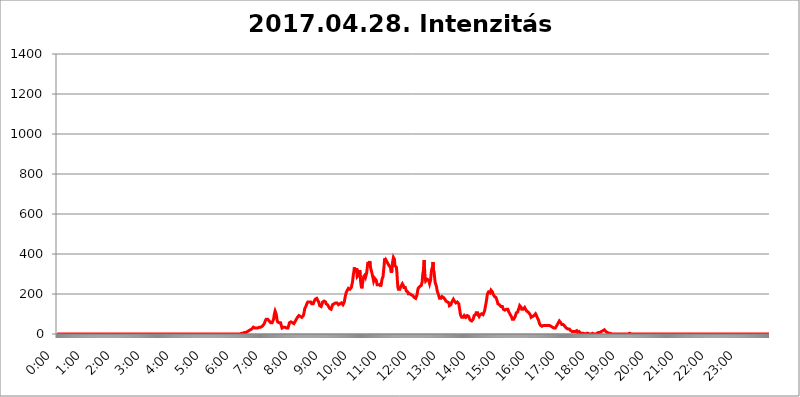
| Category | 2017.04.28. Intenzitás [W/m^2] |
|---|---|
| 0.0 | 0 |
| 0.0006944444444444445 | 0 |
| 0.001388888888888889 | 0 |
| 0.0020833333333333333 | 0 |
| 0.002777777777777778 | 0 |
| 0.003472222222222222 | 0 |
| 0.004166666666666667 | 0 |
| 0.004861111111111111 | 0 |
| 0.005555555555555556 | 0 |
| 0.0062499999999999995 | 0 |
| 0.006944444444444444 | 0 |
| 0.007638888888888889 | 0 |
| 0.008333333333333333 | 0 |
| 0.009027777777777779 | 0 |
| 0.009722222222222222 | 0 |
| 0.010416666666666666 | 0 |
| 0.011111111111111112 | 0 |
| 0.011805555555555555 | 0 |
| 0.012499999999999999 | 0 |
| 0.013194444444444444 | 0 |
| 0.013888888888888888 | 0 |
| 0.014583333333333332 | 0 |
| 0.015277777777777777 | 0 |
| 0.015972222222222224 | 0 |
| 0.016666666666666666 | 0 |
| 0.017361111111111112 | 0 |
| 0.018055555555555557 | 0 |
| 0.01875 | 0 |
| 0.019444444444444445 | 0 |
| 0.02013888888888889 | 0 |
| 0.020833333333333332 | 0 |
| 0.02152777777777778 | 0 |
| 0.022222222222222223 | 0 |
| 0.02291666666666667 | 0 |
| 0.02361111111111111 | 0 |
| 0.024305555555555556 | 0 |
| 0.024999999999999998 | 0 |
| 0.025694444444444447 | 0 |
| 0.02638888888888889 | 0 |
| 0.027083333333333334 | 0 |
| 0.027777777777777776 | 0 |
| 0.02847222222222222 | 0 |
| 0.029166666666666664 | 0 |
| 0.029861111111111113 | 0 |
| 0.030555555555555555 | 0 |
| 0.03125 | 0 |
| 0.03194444444444445 | 0 |
| 0.03263888888888889 | 0 |
| 0.03333333333333333 | 0 |
| 0.034027777777777775 | 0 |
| 0.034722222222222224 | 0 |
| 0.035416666666666666 | 0 |
| 0.036111111111111115 | 0 |
| 0.03680555555555556 | 0 |
| 0.0375 | 0 |
| 0.03819444444444444 | 0 |
| 0.03888888888888889 | 0 |
| 0.03958333333333333 | 0 |
| 0.04027777777777778 | 0 |
| 0.04097222222222222 | 0 |
| 0.041666666666666664 | 0 |
| 0.042361111111111106 | 0 |
| 0.04305555555555556 | 0 |
| 0.043750000000000004 | 0 |
| 0.044444444444444446 | 0 |
| 0.04513888888888889 | 0 |
| 0.04583333333333334 | 0 |
| 0.04652777777777778 | 0 |
| 0.04722222222222222 | 0 |
| 0.04791666666666666 | 0 |
| 0.04861111111111111 | 0 |
| 0.049305555555555554 | 0 |
| 0.049999999999999996 | 0 |
| 0.05069444444444445 | 0 |
| 0.051388888888888894 | 0 |
| 0.052083333333333336 | 0 |
| 0.05277777777777778 | 0 |
| 0.05347222222222222 | 0 |
| 0.05416666666666667 | 0 |
| 0.05486111111111111 | 0 |
| 0.05555555555555555 | 0 |
| 0.05625 | 0 |
| 0.05694444444444444 | 0 |
| 0.057638888888888885 | 0 |
| 0.05833333333333333 | 0 |
| 0.05902777777777778 | 0 |
| 0.059722222222222225 | 0 |
| 0.06041666666666667 | 0 |
| 0.061111111111111116 | 0 |
| 0.06180555555555556 | 0 |
| 0.0625 | 0 |
| 0.06319444444444444 | 0 |
| 0.06388888888888888 | 0 |
| 0.06458333333333334 | 0 |
| 0.06527777777777778 | 0 |
| 0.06597222222222222 | 0 |
| 0.06666666666666667 | 0 |
| 0.06736111111111111 | 0 |
| 0.06805555555555555 | 0 |
| 0.06874999999999999 | 0 |
| 0.06944444444444443 | 0 |
| 0.07013888888888889 | 0 |
| 0.07083333333333333 | 0 |
| 0.07152777777777779 | 0 |
| 0.07222222222222223 | 0 |
| 0.07291666666666667 | 0 |
| 0.07361111111111111 | 0 |
| 0.07430555555555556 | 0 |
| 0.075 | 0 |
| 0.07569444444444444 | 0 |
| 0.0763888888888889 | 0 |
| 0.07708333333333334 | 0 |
| 0.07777777777777778 | 0 |
| 0.07847222222222222 | 0 |
| 0.07916666666666666 | 0 |
| 0.0798611111111111 | 0 |
| 0.08055555555555556 | 0 |
| 0.08125 | 0 |
| 0.08194444444444444 | 0 |
| 0.08263888888888889 | 0 |
| 0.08333333333333333 | 0 |
| 0.08402777777777777 | 0 |
| 0.08472222222222221 | 0 |
| 0.08541666666666665 | 0 |
| 0.08611111111111112 | 0 |
| 0.08680555555555557 | 0 |
| 0.08750000000000001 | 0 |
| 0.08819444444444445 | 0 |
| 0.08888888888888889 | 0 |
| 0.08958333333333333 | 0 |
| 0.09027777777777778 | 0 |
| 0.09097222222222222 | 0 |
| 0.09166666666666667 | 0 |
| 0.09236111111111112 | 0 |
| 0.09305555555555556 | 0 |
| 0.09375 | 0 |
| 0.09444444444444444 | 0 |
| 0.09513888888888888 | 0 |
| 0.09583333333333333 | 0 |
| 0.09652777777777777 | 0 |
| 0.09722222222222222 | 0 |
| 0.09791666666666667 | 0 |
| 0.09861111111111111 | 0 |
| 0.09930555555555555 | 0 |
| 0.09999999999999999 | 0 |
| 0.10069444444444443 | 0 |
| 0.1013888888888889 | 0 |
| 0.10208333333333335 | 0 |
| 0.10277777777777779 | 0 |
| 0.10347222222222223 | 0 |
| 0.10416666666666667 | 0 |
| 0.10486111111111111 | 0 |
| 0.10555555555555556 | 0 |
| 0.10625 | 0 |
| 0.10694444444444444 | 0 |
| 0.1076388888888889 | 0 |
| 0.10833333333333334 | 0 |
| 0.10902777777777778 | 0 |
| 0.10972222222222222 | 0 |
| 0.1111111111111111 | 0 |
| 0.11180555555555556 | 0 |
| 0.11180555555555556 | 0 |
| 0.1125 | 0 |
| 0.11319444444444444 | 0 |
| 0.11388888888888889 | 0 |
| 0.11458333333333333 | 0 |
| 0.11527777777777777 | 0 |
| 0.11597222222222221 | 0 |
| 0.11666666666666665 | 0 |
| 0.1173611111111111 | 0 |
| 0.11805555555555557 | 0 |
| 0.11944444444444445 | 0 |
| 0.12013888888888889 | 0 |
| 0.12083333333333333 | 0 |
| 0.12152777777777778 | 0 |
| 0.12222222222222223 | 0 |
| 0.12291666666666667 | 0 |
| 0.12291666666666667 | 0 |
| 0.12361111111111112 | 0 |
| 0.12430555555555556 | 0 |
| 0.125 | 0 |
| 0.12569444444444444 | 0 |
| 0.12638888888888888 | 0 |
| 0.12708333333333333 | 0 |
| 0.16875 | 0 |
| 0.12847222222222224 | 0 |
| 0.12916666666666668 | 0 |
| 0.12986111111111112 | 0 |
| 0.13055555555555556 | 0 |
| 0.13125 | 0 |
| 0.13194444444444445 | 0 |
| 0.1326388888888889 | 0 |
| 0.13333333333333333 | 0 |
| 0.13402777777777777 | 0 |
| 0.13402777777777777 | 0 |
| 0.13472222222222222 | 0 |
| 0.13541666666666666 | 0 |
| 0.1361111111111111 | 0 |
| 0.13749999999999998 | 0 |
| 0.13819444444444443 | 0 |
| 0.1388888888888889 | 0 |
| 0.13958333333333334 | 0 |
| 0.14027777777777778 | 0 |
| 0.14097222222222222 | 0 |
| 0.14166666666666666 | 0 |
| 0.1423611111111111 | 0 |
| 0.14305555555555557 | 0 |
| 0.14375000000000002 | 0 |
| 0.14444444444444446 | 0 |
| 0.1451388888888889 | 0 |
| 0.1451388888888889 | 0 |
| 0.14652777777777778 | 0 |
| 0.14722222222222223 | 0 |
| 0.14791666666666667 | 0 |
| 0.1486111111111111 | 0 |
| 0.14930555555555555 | 0 |
| 0.15 | 0 |
| 0.15069444444444444 | 0 |
| 0.15138888888888888 | 0 |
| 0.15208333333333332 | 0 |
| 0.15277777777777776 | 0 |
| 0.15347222222222223 | 0 |
| 0.15416666666666667 | 0 |
| 0.15486111111111112 | 0 |
| 0.15555555555555556 | 0 |
| 0.15625 | 0 |
| 0.15694444444444444 | 0 |
| 0.15763888888888888 | 0 |
| 0.15833333333333333 | 0 |
| 0.15902777777777777 | 0 |
| 0.15972222222222224 | 0 |
| 0.16041666666666668 | 0 |
| 0.16111111111111112 | 0 |
| 0.16180555555555556 | 0 |
| 0.1625 | 0 |
| 0.16319444444444445 | 0 |
| 0.1638888888888889 | 0 |
| 0.16458333333333333 | 0 |
| 0.16527777777777777 | 0 |
| 0.16597222222222222 | 0 |
| 0.16666666666666666 | 0 |
| 0.1673611111111111 | 0 |
| 0.16805555555555554 | 0 |
| 0.16874999999999998 | 0 |
| 0.16944444444444443 | 0 |
| 0.17013888888888887 | 0 |
| 0.1708333333333333 | 0 |
| 0.17152777777777775 | 0 |
| 0.17222222222222225 | 0 |
| 0.1729166666666667 | 0 |
| 0.17361111111111113 | 0 |
| 0.17430555555555557 | 0 |
| 0.17500000000000002 | 0 |
| 0.17569444444444446 | 0 |
| 0.1763888888888889 | 0 |
| 0.17708333333333334 | 0 |
| 0.17777777777777778 | 0 |
| 0.17847222222222223 | 0 |
| 0.17916666666666667 | 0 |
| 0.1798611111111111 | 0 |
| 0.18055555555555555 | 0 |
| 0.18125 | 0 |
| 0.18194444444444444 | 0 |
| 0.1826388888888889 | 0 |
| 0.18333333333333335 | 0 |
| 0.1840277777777778 | 0 |
| 0.18472222222222223 | 0 |
| 0.18541666666666667 | 0 |
| 0.18611111111111112 | 0 |
| 0.18680555555555556 | 0 |
| 0.1875 | 0 |
| 0.18819444444444444 | 0 |
| 0.18888888888888888 | 0 |
| 0.18958333333333333 | 0 |
| 0.19027777777777777 | 0 |
| 0.1909722222222222 | 0 |
| 0.19166666666666665 | 0 |
| 0.19236111111111112 | 0 |
| 0.19305555555555554 | 0 |
| 0.19375 | 0 |
| 0.19444444444444445 | 0 |
| 0.1951388888888889 | 0 |
| 0.19583333333333333 | 0 |
| 0.19652777777777777 | 0 |
| 0.19722222222222222 | 0 |
| 0.19791666666666666 | 0 |
| 0.1986111111111111 | 0 |
| 0.19930555555555554 | 0 |
| 0.19999999999999998 | 0 |
| 0.20069444444444443 | 0 |
| 0.20138888888888887 | 0 |
| 0.2020833333333333 | 0 |
| 0.2027777777777778 | 0 |
| 0.2034722222222222 | 0 |
| 0.2041666666666667 | 0 |
| 0.20486111111111113 | 0 |
| 0.20555555555555557 | 0 |
| 0.20625000000000002 | 0 |
| 0.20694444444444446 | 0 |
| 0.2076388888888889 | 0 |
| 0.20833333333333334 | 0 |
| 0.20902777777777778 | 0 |
| 0.20972222222222223 | 0 |
| 0.21041666666666667 | 0 |
| 0.2111111111111111 | 0 |
| 0.21180555555555555 | 0 |
| 0.2125 | 0 |
| 0.21319444444444444 | 0 |
| 0.2138888888888889 | 0 |
| 0.21458333333333335 | 0 |
| 0.2152777777777778 | 0 |
| 0.21597222222222223 | 0 |
| 0.21666666666666667 | 0 |
| 0.21736111111111112 | 0 |
| 0.21805555555555556 | 0 |
| 0.21875 | 0 |
| 0.21944444444444444 | 0 |
| 0.22013888888888888 | 0 |
| 0.22083333333333333 | 0 |
| 0.22152777777777777 | 0 |
| 0.2222222222222222 | 0 |
| 0.22291666666666665 | 0 |
| 0.2236111111111111 | 0 |
| 0.22430555555555556 | 0 |
| 0.225 | 0 |
| 0.22569444444444445 | 0 |
| 0.2263888888888889 | 0 |
| 0.22708333333333333 | 0 |
| 0.22777777777777777 | 0 |
| 0.22847222222222222 | 0 |
| 0.22916666666666666 | 0 |
| 0.2298611111111111 | 0 |
| 0.23055555555555554 | 0 |
| 0.23124999999999998 | 0 |
| 0.23194444444444443 | 0 |
| 0.23263888888888887 | 0 |
| 0.2333333333333333 | 0 |
| 0.2340277777777778 | 0 |
| 0.2347222222222222 | 0 |
| 0.2354166666666667 | 0 |
| 0.23611111111111113 | 0 |
| 0.23680555555555557 | 0 |
| 0.23750000000000002 | 0 |
| 0.23819444444444446 | 0 |
| 0.2388888888888889 | 0 |
| 0.23958333333333334 | 0 |
| 0.24027777777777778 | 0 |
| 0.24097222222222223 | 0 |
| 0.24166666666666667 | 0 |
| 0.2423611111111111 | 0 |
| 0.24305555555555555 | 0 |
| 0.24375 | 0 |
| 0.24444444444444446 | 0 |
| 0.24513888888888888 | 0 |
| 0.24583333333333335 | 0 |
| 0.2465277777777778 | 0 |
| 0.24722222222222223 | 0 |
| 0.24791666666666667 | 0 |
| 0.24861111111111112 | 0 |
| 0.24930555555555556 | 0 |
| 0.25 | 0 |
| 0.25069444444444444 | 0 |
| 0.2513888888888889 | 0 |
| 0.2520833333333333 | 0 |
| 0.25277777777777777 | 0 |
| 0.2534722222222222 | 0 |
| 0.25416666666666665 | 0 |
| 0.2548611111111111 | 0 |
| 0.2555555555555556 | 0 |
| 0.25625000000000003 | 0 |
| 0.2569444444444445 | 3.525 |
| 0.2576388888888889 | 3.525 |
| 0.25833333333333336 | 3.525 |
| 0.2590277777777778 | 3.525 |
| 0.25972222222222224 | 3.525 |
| 0.2604166666666667 | 3.525 |
| 0.2611111111111111 | 3.525 |
| 0.26180555555555557 | 7.887 |
| 0.2625 | 7.887 |
| 0.26319444444444445 | 7.887 |
| 0.2638888888888889 | 7.887 |
| 0.26458333333333334 | 7.887 |
| 0.2652777777777778 | 12.257 |
| 0.2659722222222222 | 12.257 |
| 0.26666666666666666 | 12.257 |
| 0.2673611111111111 | 12.257 |
| 0.26805555555555555 | 16.636 |
| 0.26875 | 16.636 |
| 0.26944444444444443 | 16.636 |
| 0.2701388888888889 | 21.024 |
| 0.2708333333333333 | 21.024 |
| 0.27152777777777776 | 21.024 |
| 0.2722222222222222 | 25.419 |
| 0.27291666666666664 | 25.419 |
| 0.2736111111111111 | 29.823 |
| 0.2743055555555555 | 29.823 |
| 0.27499999999999997 | 34.234 |
| 0.27569444444444446 | 34.234 |
| 0.27638888888888885 | 34.234 |
| 0.27708333333333335 | 29.823 |
| 0.2777777777777778 | 29.823 |
| 0.27847222222222223 | 29.823 |
| 0.2791666666666667 | 29.823 |
| 0.2798611111111111 | 25.419 |
| 0.28055555555555556 | 29.823 |
| 0.28125 | 29.823 |
| 0.28194444444444444 | 34.234 |
| 0.2826388888888889 | 34.234 |
| 0.2833333333333333 | 34.234 |
| 0.28402777777777777 | 34.234 |
| 0.2847222222222222 | 34.234 |
| 0.28541666666666665 | 34.234 |
| 0.28611111111111115 | 38.653 |
| 0.28680555555555554 | 38.653 |
| 0.28750000000000003 | 38.653 |
| 0.2881944444444445 | 38.653 |
| 0.2888888888888889 | 43.079 |
| 0.28958333333333336 | 47.511 |
| 0.2902777777777778 | 51.951 |
| 0.29097222222222224 | 56.398 |
| 0.2916666666666667 | 65.31 |
| 0.2923611111111111 | 69.775 |
| 0.29305555555555557 | 74.246 |
| 0.29375 | 74.246 |
| 0.29444444444444445 | 74.246 |
| 0.2951388888888889 | 74.246 |
| 0.29583333333333334 | 69.775 |
| 0.2965277777777778 | 69.775 |
| 0.2972222222222222 | 65.31 |
| 0.29791666666666666 | 65.31 |
| 0.2986111111111111 | 60.85 |
| 0.29930555555555555 | 56.398 |
| 0.3 | 56.398 |
| 0.30069444444444443 | 56.398 |
| 0.3013888888888889 | 56.398 |
| 0.3020833333333333 | 56.398 |
| 0.30277777777777776 | 60.85 |
| 0.3034722222222222 | 74.246 |
| 0.30416666666666664 | 92.184 |
| 0.3048611111111111 | 105.69 |
| 0.3055555555555555 | 114.716 |
| 0.30624999999999997 | 110.201 |
| 0.3069444444444444 | 101.184 |
| 0.3076388888888889 | 87.692 |
| 0.30833333333333335 | 69.775 |
| 0.3090277777777778 | 60.85 |
| 0.30972222222222223 | 56.398 |
| 0.3104166666666667 | 56.398 |
| 0.3111111111111111 | 56.398 |
| 0.31180555555555556 | 60.85 |
| 0.3125 | 60.85 |
| 0.31319444444444444 | 56.398 |
| 0.3138888888888889 | 47.511 |
| 0.3145833333333333 | 38.653 |
| 0.31527777777777777 | 29.823 |
| 0.3159722222222222 | 29.823 |
| 0.31666666666666665 | 29.823 |
| 0.31736111111111115 | 34.234 |
| 0.31805555555555554 | 34.234 |
| 0.31875000000000003 | 38.653 |
| 0.3194444444444445 | 34.234 |
| 0.3201388888888889 | 34.234 |
| 0.32083333333333336 | 34.234 |
| 0.3215277777777778 | 29.823 |
| 0.32222222222222224 | 29.823 |
| 0.3229166666666667 | 29.823 |
| 0.3236111111111111 | 29.823 |
| 0.32430555555555557 | 38.653 |
| 0.325 | 47.511 |
| 0.32569444444444445 | 56.398 |
| 0.3263888888888889 | 60.85 |
| 0.32708333333333334 | 60.85 |
| 0.3277777777777778 | 60.85 |
| 0.3284722222222222 | 60.85 |
| 0.32916666666666666 | 56.398 |
| 0.3298611111111111 | 56.398 |
| 0.33055555555555555 | 51.951 |
| 0.33125 | 51.951 |
| 0.33194444444444443 | 51.951 |
| 0.3326388888888889 | 56.398 |
| 0.3333333333333333 | 60.85 |
| 0.3340277777777778 | 65.31 |
| 0.3347222222222222 | 65.31 |
| 0.3354166666666667 | 74.246 |
| 0.3361111111111111 | 78.722 |
| 0.3368055555555556 | 83.205 |
| 0.33749999999999997 | 83.205 |
| 0.33819444444444446 | 87.692 |
| 0.33888888888888885 | 92.184 |
| 0.33958333333333335 | 92.184 |
| 0.34027777777777773 | 92.184 |
| 0.34097222222222223 | 87.692 |
| 0.3416666666666666 | 83.205 |
| 0.3423611111111111 | 83.205 |
| 0.3430555555555555 | 83.205 |
| 0.34375 | 83.205 |
| 0.3444444444444445 | 83.205 |
| 0.3451388888888889 | 92.184 |
| 0.3458333333333334 | 101.184 |
| 0.34652777777777777 | 114.716 |
| 0.34722222222222227 | 128.284 |
| 0.34791666666666665 | 132.814 |
| 0.34861111111111115 | 137.347 |
| 0.34930555555555554 | 141.884 |
| 0.35000000000000003 | 150.964 |
| 0.3506944444444444 | 155.509 |
| 0.3513888888888889 | 160.056 |
| 0.3520833333333333 | 164.605 |
| 0.3527777777777778 | 164.605 |
| 0.3534722222222222 | 160.056 |
| 0.3541666666666667 | 160.056 |
| 0.3548611111111111 | 160.056 |
| 0.35555555555555557 | 160.056 |
| 0.35625 | 155.509 |
| 0.35694444444444445 | 150.964 |
| 0.3576388888888889 | 150.964 |
| 0.35833333333333334 | 150.964 |
| 0.3590277777777778 | 150.964 |
| 0.3597222222222222 | 155.509 |
| 0.36041666666666666 | 164.605 |
| 0.3611111111111111 | 169.156 |
| 0.36180555555555555 | 173.709 |
| 0.3625 | 173.709 |
| 0.36319444444444443 | 178.264 |
| 0.3638888888888889 | 178.264 |
| 0.3645833333333333 | 173.709 |
| 0.3652777777777778 | 169.156 |
| 0.3659722222222222 | 164.605 |
| 0.3666666666666667 | 160.056 |
| 0.3673611111111111 | 150.964 |
| 0.3680555555555556 | 141.884 |
| 0.36874999999999997 | 137.347 |
| 0.36944444444444446 | 137.347 |
| 0.37013888888888885 | 137.347 |
| 0.37083333333333335 | 141.884 |
| 0.37152777777777773 | 150.964 |
| 0.37222222222222223 | 160.056 |
| 0.3729166666666666 | 164.605 |
| 0.3736111111111111 | 164.605 |
| 0.3743055555555555 | 164.605 |
| 0.375 | 169.156 |
| 0.3756944444444445 | 164.605 |
| 0.3763888888888889 | 160.056 |
| 0.3770833333333334 | 150.964 |
| 0.37777777777777777 | 150.964 |
| 0.37847222222222227 | 150.964 |
| 0.37916666666666665 | 146.423 |
| 0.37986111111111115 | 146.423 |
| 0.38055555555555554 | 137.347 |
| 0.38125000000000003 | 132.814 |
| 0.3819444444444444 | 128.284 |
| 0.3826388888888889 | 128.284 |
| 0.3833333333333333 | 123.758 |
| 0.3840277777777778 | 123.758 |
| 0.3847222222222222 | 128.284 |
| 0.3854166666666667 | 137.347 |
| 0.3861111111111111 | 146.423 |
| 0.38680555555555557 | 150.964 |
| 0.3875 | 150.964 |
| 0.38819444444444445 | 150.964 |
| 0.3888888888888889 | 150.964 |
| 0.38958333333333334 | 155.509 |
| 0.3902777777777778 | 155.509 |
| 0.3909722222222222 | 155.509 |
| 0.39166666666666666 | 155.509 |
| 0.3923611111111111 | 155.509 |
| 0.39305555555555555 | 155.509 |
| 0.39375 | 150.964 |
| 0.39444444444444443 | 146.423 |
| 0.3951388888888889 | 146.423 |
| 0.3958333333333333 | 146.423 |
| 0.3965277777777778 | 150.964 |
| 0.3972222222222222 | 150.964 |
| 0.3979166666666667 | 150.964 |
| 0.3986111111111111 | 155.509 |
| 0.3993055555555556 | 150.964 |
| 0.39999999999999997 | 150.964 |
| 0.40069444444444446 | 146.423 |
| 0.40138888888888885 | 150.964 |
| 0.40208333333333335 | 155.509 |
| 0.40277777777777773 | 164.605 |
| 0.40347222222222223 | 178.264 |
| 0.4041666666666666 | 191.937 |
| 0.4048611111111111 | 201.058 |
| 0.4055555555555555 | 210.182 |
| 0.40625 | 210.182 |
| 0.4069444444444445 | 219.309 |
| 0.4076388888888889 | 223.873 |
| 0.4083333333333334 | 228.436 |
| 0.40902777777777777 | 228.436 |
| 0.40972222222222227 | 228.436 |
| 0.41041666666666665 | 223.873 |
| 0.41111111111111115 | 219.309 |
| 0.41180555555555554 | 223.873 |
| 0.41250000000000003 | 233 |
| 0.4131944444444444 | 246.689 |
| 0.4138888888888889 | 255.813 |
| 0.4145833333333333 | 274.047 |
| 0.4152777777777778 | 296.808 |
| 0.4159722222222222 | 310.44 |
| 0.4166666666666667 | 333.113 |
| 0.4173611111111111 | 319.517 |
| 0.41805555555555557 | 314.98 |
| 0.41875 | 314.98 |
| 0.41944444444444445 | 314.98 |
| 0.4201388888888889 | 328.584 |
| 0.42083333333333334 | 287.709 |
| 0.4215277777777778 | 287.709 |
| 0.4222222222222222 | 292.259 |
| 0.42291666666666666 | 296.808 |
| 0.4236111111111111 | 296.808 |
| 0.42430555555555555 | 319.517 |
| 0.425 | 283.156 |
| 0.42569444444444443 | 255.813 |
| 0.4263888888888889 | 237.564 |
| 0.4270833333333333 | 228.436 |
| 0.4277777777777778 | 242.127 |
| 0.4284722222222222 | 260.373 |
| 0.4291666666666667 | 274.047 |
| 0.4298611111111111 | 287.709 |
| 0.4305555555555556 | 287.709 |
| 0.43124999999999997 | 292.259 |
| 0.43194444444444446 | 296.808 |
| 0.43263888888888885 | 287.709 |
| 0.43333333333333335 | 292.259 |
| 0.43402777777777773 | 305.898 |
| 0.43472222222222223 | 328.584 |
| 0.4354166666666666 | 351.198 |
| 0.4361111111111111 | 360.221 |
| 0.4368055555555555 | 346.682 |
| 0.4375 | 355.712 |
| 0.4381944444444445 | 364.728 |
| 0.4388888888888889 | 351.198 |
| 0.4395833333333334 | 328.584 |
| 0.44027777777777777 | 319.517 |
| 0.44097222222222227 | 310.44 |
| 0.44166666666666665 | 305.898 |
| 0.44236111111111115 | 287.709 |
| 0.44305555555555554 | 278.603 |
| 0.44375000000000003 | 264.932 |
| 0.4444444444444444 | 269.49 |
| 0.4451388888888889 | 278.603 |
| 0.4458333333333333 | 283.156 |
| 0.4465277777777778 | 278.603 |
| 0.4472222222222222 | 269.49 |
| 0.4479166666666667 | 260.373 |
| 0.4486111111111111 | 246.689 |
| 0.44930555555555557 | 242.127 |
| 0.45 | 242.127 |
| 0.45069444444444445 | 246.689 |
| 0.4513888888888889 | 251.251 |
| 0.45208333333333334 | 251.251 |
| 0.4527777777777778 | 246.689 |
| 0.4534722222222222 | 237.564 |
| 0.45416666666666666 | 242.127 |
| 0.4548611111111111 | 260.373 |
| 0.45555555555555555 | 274.047 |
| 0.45625 | 278.603 |
| 0.45694444444444443 | 287.709 |
| 0.4576388888888889 | 314.98 |
| 0.4583333333333333 | 337.639 |
| 0.4590277777777778 | 369.23 |
| 0.4597222222222222 | 378.224 |
| 0.4604166666666667 | 360.221 |
| 0.4611111111111111 | 369.23 |
| 0.4618055555555556 | 369.23 |
| 0.46249999999999997 | 364.728 |
| 0.46319444444444446 | 355.712 |
| 0.46388888888888885 | 351.198 |
| 0.46458333333333335 | 351.198 |
| 0.46527777777777773 | 342.162 |
| 0.46597222222222223 | 337.639 |
| 0.4666666666666666 | 342.162 |
| 0.4673611111111111 | 333.113 |
| 0.4680555555555555 | 314.98 |
| 0.46875 | 305.898 |
| 0.4694444444444445 | 319.517 |
| 0.4701388888888889 | 355.712 |
| 0.4708333333333334 | 369.23 |
| 0.47152777777777777 | 382.715 |
| 0.47222222222222227 | 382.715 |
| 0.47291666666666665 | 373.729 |
| 0.47361111111111115 | 342.162 |
| 0.47430555555555554 | 346.682 |
| 0.47500000000000003 | 342.162 |
| 0.4756944444444444 | 333.113 |
| 0.4763888888888889 | 305.898 |
| 0.4770833333333333 | 264.932 |
| 0.4777777777777778 | 233 |
| 0.4784722222222222 | 223.873 |
| 0.4791666666666667 | 219.309 |
| 0.4798611111111111 | 219.309 |
| 0.48055555555555557 | 223.873 |
| 0.48125 | 233 |
| 0.48194444444444445 | 237.564 |
| 0.4826388888888889 | 242.127 |
| 0.48333333333333334 | 246.689 |
| 0.4840277777777778 | 251.251 |
| 0.4847222222222222 | 251.251 |
| 0.48541666666666666 | 242.127 |
| 0.4861111111111111 | 233 |
| 0.48680555555555555 | 233 |
| 0.4875 | 233 |
| 0.48819444444444443 | 233 |
| 0.4888888888888889 | 223.873 |
| 0.4895833333333333 | 214.746 |
| 0.4902777777777778 | 214.746 |
| 0.4909722222222222 | 214.746 |
| 0.4916666666666667 | 210.182 |
| 0.4923611111111111 | 201.058 |
| 0.4930555555555556 | 196.497 |
| 0.49374999999999997 | 201.058 |
| 0.49444444444444446 | 201.058 |
| 0.49513888888888885 | 201.058 |
| 0.49583333333333335 | 201.058 |
| 0.49652777777777773 | 196.497 |
| 0.49722222222222223 | 191.937 |
| 0.4979166666666666 | 191.937 |
| 0.4986111111111111 | 191.937 |
| 0.4993055555555555 | 187.378 |
| 0.5 | 187.378 |
| 0.5006944444444444 | 182.82 |
| 0.5013888888888889 | 182.82 |
| 0.5020833333333333 | 178.264 |
| 0.5027777777777778 | 178.264 |
| 0.5034722222222222 | 182.82 |
| 0.5041666666666667 | 191.937 |
| 0.5048611111111111 | 201.058 |
| 0.5055555555555555 | 219.309 |
| 0.50625 | 228.436 |
| 0.5069444444444444 | 233 |
| 0.5076388888888889 | 233 |
| 0.5083333333333333 | 237.564 |
| 0.5090277777777777 | 242.127 |
| 0.5097222222222222 | 242.127 |
| 0.5104166666666666 | 242.127 |
| 0.5111111111111112 | 246.689 |
| 0.5118055555555555 | 260.373 |
| 0.5125000000000001 | 292.259 |
| 0.5131944444444444 | 310.44 |
| 0.513888888888889 | 337.639 |
| 0.5145833333333333 | 369.23 |
| 0.5152777777777778 | 319.517 |
| 0.5159722222222222 | 278.603 |
| 0.5166666666666667 | 264.932 |
| 0.517361111111111 | 264.932 |
| 0.5180555555555556 | 264.932 |
| 0.5187499999999999 | 274.047 |
| 0.5194444444444445 | 278.603 |
| 0.5201388888888888 | 274.047 |
| 0.5208333333333334 | 269.49 |
| 0.5215277777777778 | 260.373 |
| 0.5222222222222223 | 251.251 |
| 0.5229166666666667 | 251.251 |
| 0.5236111111111111 | 269.49 |
| 0.5243055555555556 | 296.808 |
| 0.525 | 319.517 |
| 0.5256944444444445 | 328.584 |
| 0.5263888888888889 | 337.639 |
| 0.5270833333333333 | 360.221 |
| 0.5277777777777778 | 319.517 |
| 0.5284722222222222 | 310.44 |
| 0.5291666666666667 | 287.709 |
| 0.5298611111111111 | 260.373 |
| 0.5305555555555556 | 251.251 |
| 0.53125 | 251.251 |
| 0.5319444444444444 | 237.564 |
| 0.5326388888888889 | 219.309 |
| 0.5333333333333333 | 210.182 |
| 0.5340277777777778 | 205.62 |
| 0.5347222222222222 | 196.497 |
| 0.5354166666666667 | 187.378 |
| 0.5361111111111111 | 178.264 |
| 0.5368055555555555 | 178.264 |
| 0.5375 | 182.82 |
| 0.5381944444444444 | 178.264 |
| 0.5388888888888889 | 182.82 |
| 0.5395833333333333 | 187.378 |
| 0.5402777777777777 | 191.937 |
| 0.5409722222222222 | 187.378 |
| 0.5416666666666666 | 182.82 |
| 0.5423611111111112 | 182.82 |
| 0.5430555555555555 | 178.264 |
| 0.5437500000000001 | 173.709 |
| 0.5444444444444444 | 173.709 |
| 0.545138888888889 | 164.605 |
| 0.5458333333333333 | 160.056 |
| 0.5465277777777778 | 160.056 |
| 0.5472222222222222 | 160.056 |
| 0.5479166666666667 | 160.056 |
| 0.548611111111111 | 160.056 |
| 0.5493055555555556 | 155.509 |
| 0.5499999999999999 | 141.884 |
| 0.5506944444444445 | 137.347 |
| 0.5513888888888888 | 141.884 |
| 0.5520833333333334 | 146.423 |
| 0.5527777777777778 | 155.509 |
| 0.5534722222222223 | 160.056 |
| 0.5541666666666667 | 164.605 |
| 0.5548611111111111 | 169.156 |
| 0.5555555555555556 | 173.709 |
| 0.55625 | 169.156 |
| 0.5569444444444445 | 164.605 |
| 0.5576388888888889 | 160.056 |
| 0.5583333333333333 | 160.056 |
| 0.5590277777777778 | 155.509 |
| 0.5597222222222222 | 155.509 |
| 0.5604166666666667 | 155.509 |
| 0.5611111111111111 | 160.056 |
| 0.5618055555555556 | 164.605 |
| 0.5625 | 164.605 |
| 0.5631944444444444 | 150.964 |
| 0.5638888888888889 | 132.814 |
| 0.5645833333333333 | 119.235 |
| 0.5652777777777778 | 101.184 |
| 0.5659722222222222 | 92.184 |
| 0.5666666666666667 | 87.692 |
| 0.5673611111111111 | 83.205 |
| 0.5680555555555555 | 83.205 |
| 0.56875 | 83.205 |
| 0.5694444444444444 | 83.205 |
| 0.5701388888888889 | 83.205 |
| 0.5708333333333333 | 92.184 |
| 0.5715277777777777 | 92.184 |
| 0.5722222222222222 | 92.184 |
| 0.5729166666666666 | 83.205 |
| 0.5736111111111112 | 83.205 |
| 0.5743055555555555 | 87.692 |
| 0.5750000000000001 | 92.184 |
| 0.5756944444444444 | 96.682 |
| 0.576388888888889 | 96.682 |
| 0.5770833333333333 | 87.692 |
| 0.5777777777777778 | 78.722 |
| 0.5784722222222222 | 74.246 |
| 0.5791666666666667 | 69.775 |
| 0.579861111111111 | 65.31 |
| 0.5805555555555556 | 65.31 |
| 0.5812499999999999 | 65.31 |
| 0.5819444444444445 | 65.31 |
| 0.5826388888888888 | 65.31 |
| 0.5833333333333334 | 74.246 |
| 0.5840277777777778 | 83.205 |
| 0.5847222222222223 | 92.184 |
| 0.5854166666666667 | 92.184 |
| 0.5861111111111111 | 92.184 |
| 0.5868055555555556 | 96.682 |
| 0.5875 | 105.69 |
| 0.5881944444444445 | 110.201 |
| 0.5888888888888889 | 110.201 |
| 0.5895833333333333 | 105.69 |
| 0.5902777777777778 | 96.682 |
| 0.5909722222222222 | 92.184 |
| 0.5916666666666667 | 87.692 |
| 0.5923611111111111 | 92.184 |
| 0.5930555555555556 | 96.682 |
| 0.59375 | 96.682 |
| 0.5944444444444444 | 96.682 |
| 0.5951388888888889 | 101.184 |
| 0.5958333333333333 | 101.184 |
| 0.5965277777777778 | 101.184 |
| 0.5972222222222222 | 96.682 |
| 0.5979166666666667 | 96.682 |
| 0.5986111111111111 | 101.184 |
| 0.5993055555555555 | 114.716 |
| 0.6 | 128.284 |
| 0.6006944444444444 | 141.884 |
| 0.6013888888888889 | 155.509 |
| 0.6020833333333333 | 169.156 |
| 0.6027777777777777 | 187.378 |
| 0.6034722222222222 | 201.058 |
| 0.6041666666666666 | 205.62 |
| 0.6048611111111112 | 210.182 |
| 0.6055555555555555 | 210.182 |
| 0.6062500000000001 | 205.62 |
| 0.6069444444444444 | 205.62 |
| 0.607638888888889 | 210.182 |
| 0.6083333333333333 | 219.309 |
| 0.6090277777777778 | 219.309 |
| 0.6097222222222222 | 219.309 |
| 0.6104166666666667 | 210.182 |
| 0.611111111111111 | 201.058 |
| 0.6118055555555556 | 201.058 |
| 0.6124999999999999 | 196.497 |
| 0.6131944444444445 | 187.378 |
| 0.6138888888888888 | 182.82 |
| 0.6145833333333334 | 182.82 |
| 0.6152777777777778 | 182.82 |
| 0.6159722222222223 | 178.264 |
| 0.6166666666666667 | 169.156 |
| 0.6173611111111111 | 160.056 |
| 0.6180555555555556 | 150.964 |
| 0.61875 | 146.423 |
| 0.6194444444444445 | 146.423 |
| 0.6201388888888889 | 146.423 |
| 0.6208333333333333 | 146.423 |
| 0.6215277777777778 | 146.423 |
| 0.6222222222222222 | 137.347 |
| 0.6229166666666667 | 137.347 |
| 0.6236111111111111 | 137.347 |
| 0.6243055555555556 | 137.347 |
| 0.625 | 132.814 |
| 0.6256944444444444 | 123.758 |
| 0.6263888888888889 | 119.235 |
| 0.6270833333333333 | 119.235 |
| 0.6277777777777778 | 119.235 |
| 0.6284722222222222 | 119.235 |
| 0.6291666666666667 | 123.758 |
| 0.6298611111111111 | 123.758 |
| 0.6305555555555555 | 123.758 |
| 0.63125 | 123.758 |
| 0.6319444444444444 | 123.758 |
| 0.6326388888888889 | 119.235 |
| 0.6333333333333333 | 110.201 |
| 0.6340277777777777 | 105.69 |
| 0.6347222222222222 | 101.184 |
| 0.6354166666666666 | 96.682 |
| 0.6361111111111112 | 92.184 |
| 0.6368055555555555 | 87.692 |
| 0.6375000000000001 | 83.205 |
| 0.6381944444444444 | 74.246 |
| 0.638888888888889 | 74.246 |
| 0.6395833333333333 | 74.246 |
| 0.6402777777777778 | 74.246 |
| 0.6409722222222222 | 74.246 |
| 0.6416666666666667 | 78.722 |
| 0.642361111111111 | 87.692 |
| 0.6430555555555556 | 96.682 |
| 0.6437499999999999 | 105.69 |
| 0.6444444444444445 | 110.201 |
| 0.6451388888888888 | 110.201 |
| 0.6458333333333334 | 110.201 |
| 0.6465277777777778 | 119.235 |
| 0.6472222222222223 | 123.758 |
| 0.6479166666666667 | 132.814 |
| 0.6486111111111111 | 141.884 |
| 0.6493055555555556 | 146.423 |
| 0.65 | 141.884 |
| 0.6506944444444445 | 132.814 |
| 0.6513888888888889 | 123.758 |
| 0.6520833333333333 | 119.235 |
| 0.6527777777777778 | 119.235 |
| 0.6534722222222222 | 123.758 |
| 0.6541666666666667 | 128.284 |
| 0.6548611111111111 | 128.284 |
| 0.6555555555555556 | 132.814 |
| 0.65625 | 128.284 |
| 0.6569444444444444 | 123.758 |
| 0.6576388888888889 | 119.235 |
| 0.6583333333333333 | 114.716 |
| 0.6590277777777778 | 110.201 |
| 0.6597222222222222 | 110.201 |
| 0.6604166666666667 | 110.201 |
| 0.6611111111111111 | 105.69 |
| 0.6618055555555555 | 105.69 |
| 0.6625 | 101.184 |
| 0.6631944444444444 | 101.184 |
| 0.6638888888888889 | 92.184 |
| 0.6645833333333333 | 83.205 |
| 0.6652777777777777 | 83.205 |
| 0.6659722222222222 | 83.205 |
| 0.6666666666666666 | 87.692 |
| 0.6673611111111111 | 87.692 |
| 0.6680555555555556 | 92.184 |
| 0.6687500000000001 | 92.184 |
| 0.6694444444444444 | 92.184 |
| 0.6701388888888888 | 96.682 |
| 0.6708333333333334 | 101.184 |
| 0.6715277777777778 | 96.682 |
| 0.6722222222222222 | 92.184 |
| 0.6729166666666666 | 87.692 |
| 0.6736111111111112 | 78.722 |
| 0.6743055555555556 | 74.246 |
| 0.6749999999999999 | 69.775 |
| 0.6756944444444444 | 60.85 |
| 0.6763888888888889 | 51.951 |
| 0.6770833333333334 | 47.511 |
| 0.6777777777777777 | 43.079 |
| 0.6784722222222223 | 43.079 |
| 0.6791666666666667 | 43.079 |
| 0.6798611111111111 | 38.653 |
| 0.6805555555555555 | 38.653 |
| 0.68125 | 43.079 |
| 0.6819444444444445 | 43.079 |
| 0.6826388888888889 | 43.079 |
| 0.6833333333333332 | 43.079 |
| 0.6840277777777778 | 43.079 |
| 0.6847222222222222 | 43.079 |
| 0.6854166666666667 | 43.079 |
| 0.686111111111111 | 43.079 |
| 0.6868055555555556 | 47.511 |
| 0.6875 | 47.511 |
| 0.6881944444444444 | 43.079 |
| 0.688888888888889 | 43.079 |
| 0.6895833333333333 | 43.079 |
| 0.6902777777777778 | 43.079 |
| 0.6909722222222222 | 43.079 |
| 0.6916666666666668 | 43.079 |
| 0.6923611111111111 | 38.653 |
| 0.6930555555555555 | 38.653 |
| 0.69375 | 34.234 |
| 0.6944444444444445 | 34.234 |
| 0.6951388888888889 | 29.823 |
| 0.6958333333333333 | 29.823 |
| 0.6965277777777777 | 29.823 |
| 0.6972222222222223 | 29.823 |
| 0.6979166666666666 | 29.823 |
| 0.6986111111111111 | 29.823 |
| 0.6993055555555556 | 34.234 |
| 0.7000000000000001 | 38.653 |
| 0.7006944444444444 | 43.079 |
| 0.7013888888888888 | 47.511 |
| 0.7020833333333334 | 51.951 |
| 0.7027777777777778 | 56.398 |
| 0.7034722222222222 | 60.85 |
| 0.7041666666666666 | 65.31 |
| 0.7048611111111112 | 65.31 |
| 0.7055555555555556 | 65.31 |
| 0.7062499999999999 | 56.398 |
| 0.7069444444444444 | 51.951 |
| 0.7076388888888889 | 47.511 |
| 0.7083333333333334 | 47.511 |
| 0.7090277777777777 | 47.511 |
| 0.7097222222222223 | 47.511 |
| 0.7104166666666667 | 47.511 |
| 0.7111111111111111 | 43.079 |
| 0.7118055555555555 | 38.653 |
| 0.7125 | 38.653 |
| 0.7131944444444445 | 34.234 |
| 0.7138888888888889 | 29.823 |
| 0.7145833333333332 | 29.823 |
| 0.7152777777777778 | 29.823 |
| 0.7159722222222222 | 25.419 |
| 0.7166666666666667 | 25.419 |
| 0.717361111111111 | 25.419 |
| 0.7180555555555556 | 25.419 |
| 0.71875 | 21.024 |
| 0.7194444444444444 | 21.024 |
| 0.720138888888889 | 16.636 |
| 0.7208333333333333 | 12.257 |
| 0.7215277777777778 | 12.257 |
| 0.7222222222222222 | 12.257 |
| 0.7229166666666668 | 7.887 |
| 0.7236111111111111 | 7.887 |
| 0.7243055555555555 | 12.257 |
| 0.725 | 12.257 |
| 0.7256944444444445 | 12.257 |
| 0.7263888888888889 | 12.257 |
| 0.7270833333333333 | 16.636 |
| 0.7277777777777777 | 16.636 |
| 0.7284722222222223 | 16.636 |
| 0.7291666666666666 | 16.636 |
| 0.7298611111111111 | 7.887 |
| 0.7305555555555556 | 3.525 |
| 0.7312500000000001 | 7.887 |
| 0.7319444444444444 | 12.257 |
| 0.7326388888888888 | 12.257 |
| 0.7333333333333334 | 7.887 |
| 0.7340277777777778 | 3.525 |
| 0.7347222222222222 | 3.525 |
| 0.7354166666666666 | 3.525 |
| 0.7361111111111112 | 3.525 |
| 0.7368055555555556 | 7.887 |
| 0.7374999999999999 | 3.525 |
| 0.7381944444444444 | 3.525 |
| 0.7388888888888889 | 3.525 |
| 0.7395833333333334 | 3.525 |
| 0.7402777777777777 | 0 |
| 0.7409722222222223 | 0 |
| 0.7416666666666667 | 3.525 |
| 0.7423611111111111 | 3.525 |
| 0.7430555555555555 | 3.525 |
| 0.74375 | 0 |
| 0.7444444444444445 | 3.525 |
| 0.7451388888888889 | 0 |
| 0.7458333333333332 | 0 |
| 0.7465277777777778 | 0 |
| 0.7472222222222222 | 0 |
| 0.7479166666666667 | 0 |
| 0.748611111111111 | 0 |
| 0.7493055555555556 | 0 |
| 0.75 | 0 |
| 0.7506944444444444 | 3.525 |
| 0.751388888888889 | 3.525 |
| 0.7520833333333333 | 3.525 |
| 0.7527777777777778 | 0 |
| 0.7534722222222222 | 0 |
| 0.7541666666666668 | 0 |
| 0.7548611111111111 | 0 |
| 0.7555555555555555 | 0 |
| 0.75625 | 0 |
| 0.7569444444444445 | 3.525 |
| 0.7576388888888889 | 3.525 |
| 0.7583333333333333 | 3.525 |
| 0.7590277777777777 | 7.887 |
| 0.7597222222222223 | 7.887 |
| 0.7604166666666666 | 7.887 |
| 0.7611111111111111 | 7.887 |
| 0.7618055555555556 | 7.887 |
| 0.7625000000000001 | 7.887 |
| 0.7631944444444444 | 12.257 |
| 0.7638888888888888 | 12.257 |
| 0.7645833333333334 | 12.257 |
| 0.7652777777777778 | 16.636 |
| 0.7659722222222222 | 16.636 |
| 0.7666666666666666 | 21.024 |
| 0.7673611111111112 | 21.024 |
| 0.7680555555555556 | 21.024 |
| 0.7687499999999999 | 16.636 |
| 0.7694444444444444 | 12.257 |
| 0.7701388888888889 | 12.257 |
| 0.7708333333333334 | 7.887 |
| 0.7715277777777777 | 7.887 |
| 0.7722222222222223 | 7.887 |
| 0.7729166666666667 | 7.887 |
| 0.7736111111111111 | 3.525 |
| 0.7743055555555555 | 3.525 |
| 0.775 | 3.525 |
| 0.7756944444444445 | 3.525 |
| 0.7763888888888889 | 3.525 |
| 0.7770833333333332 | 3.525 |
| 0.7777777777777778 | 0 |
| 0.7784722222222222 | 0 |
| 0.7791666666666667 | 0 |
| 0.779861111111111 | 0 |
| 0.7805555555555556 | 0 |
| 0.78125 | 0 |
| 0.7819444444444444 | 0 |
| 0.782638888888889 | 0 |
| 0.7833333333333333 | 0 |
| 0.7840277777777778 | 0 |
| 0.7847222222222222 | 0 |
| 0.7854166666666668 | 0 |
| 0.7861111111111111 | 0 |
| 0.7868055555555555 | 0 |
| 0.7875 | 0 |
| 0.7881944444444445 | 0 |
| 0.7888888888888889 | 0 |
| 0.7895833333333333 | 0 |
| 0.7902777777777777 | 0 |
| 0.7909722222222223 | 0 |
| 0.7916666666666666 | 0 |
| 0.7923611111111111 | 0 |
| 0.7930555555555556 | 0 |
| 0.7937500000000001 | 0 |
| 0.7944444444444444 | 0 |
| 0.7951388888888888 | 0 |
| 0.7958333333333334 | 0 |
| 0.7965277777777778 | 0 |
| 0.7972222222222222 | 0 |
| 0.7979166666666666 | 0 |
| 0.7986111111111112 | 0 |
| 0.7993055555555556 | 0 |
| 0.7999999999999999 | 0 |
| 0.8006944444444444 | 0 |
| 0.8013888888888889 | 0 |
| 0.8020833333333334 | 0 |
| 0.8027777777777777 | 3.525 |
| 0.8034722222222223 | 3.525 |
| 0.8041666666666667 | 3.525 |
| 0.8048611111111111 | 0 |
| 0.8055555555555555 | 3.525 |
| 0.80625 | 3.525 |
| 0.8069444444444445 | 0 |
| 0.8076388888888889 | 0 |
| 0.8083333333333332 | 0 |
| 0.8090277777777778 | 0 |
| 0.8097222222222222 | 0 |
| 0.8104166666666667 | 0 |
| 0.811111111111111 | 0 |
| 0.8118055555555556 | 0 |
| 0.8125 | 0 |
| 0.8131944444444444 | 0 |
| 0.813888888888889 | 0 |
| 0.8145833333333333 | 0 |
| 0.8152777777777778 | 0 |
| 0.8159722222222222 | 0 |
| 0.8166666666666668 | 0 |
| 0.8173611111111111 | 0 |
| 0.8180555555555555 | 0 |
| 0.81875 | 0 |
| 0.8194444444444445 | 0 |
| 0.8201388888888889 | 0 |
| 0.8208333333333333 | 0 |
| 0.8215277777777777 | 0 |
| 0.8222222222222223 | 0 |
| 0.8229166666666666 | 0 |
| 0.8236111111111111 | 0 |
| 0.8243055555555556 | 0 |
| 0.8250000000000001 | 0 |
| 0.8256944444444444 | 0 |
| 0.8263888888888888 | 0 |
| 0.8270833333333334 | 0 |
| 0.8277777777777778 | 0 |
| 0.8284722222222222 | 0 |
| 0.8291666666666666 | 0 |
| 0.8298611111111112 | 0 |
| 0.8305555555555556 | 0 |
| 0.8312499999999999 | 0 |
| 0.8319444444444444 | 0 |
| 0.8326388888888889 | 0 |
| 0.8333333333333334 | 0 |
| 0.8340277777777777 | 0 |
| 0.8347222222222223 | 0 |
| 0.8354166666666667 | 0 |
| 0.8361111111111111 | 0 |
| 0.8368055555555555 | 0 |
| 0.8375 | 0 |
| 0.8381944444444445 | 0 |
| 0.8388888888888889 | 0 |
| 0.8395833333333332 | 0 |
| 0.8402777777777778 | 0 |
| 0.8409722222222222 | 0 |
| 0.8416666666666667 | 0 |
| 0.842361111111111 | 0 |
| 0.8430555555555556 | 0 |
| 0.84375 | 0 |
| 0.8444444444444444 | 0 |
| 0.845138888888889 | 0 |
| 0.8458333333333333 | 0 |
| 0.8465277777777778 | 0 |
| 0.8472222222222222 | 0 |
| 0.8479166666666668 | 0 |
| 0.8486111111111111 | 0 |
| 0.8493055555555555 | 0 |
| 0.85 | 0 |
| 0.8506944444444445 | 0 |
| 0.8513888888888889 | 0 |
| 0.8520833333333333 | 0 |
| 0.8527777777777777 | 0 |
| 0.8534722222222223 | 0 |
| 0.8541666666666666 | 0 |
| 0.8548611111111111 | 0 |
| 0.8555555555555556 | 0 |
| 0.8562500000000001 | 0 |
| 0.8569444444444444 | 0 |
| 0.8576388888888888 | 0 |
| 0.8583333333333334 | 0 |
| 0.8590277777777778 | 0 |
| 0.8597222222222222 | 0 |
| 0.8604166666666666 | 0 |
| 0.8611111111111112 | 0 |
| 0.8618055555555556 | 0 |
| 0.8624999999999999 | 0 |
| 0.8631944444444444 | 0 |
| 0.8638888888888889 | 0 |
| 0.8645833333333334 | 0 |
| 0.8652777777777777 | 0 |
| 0.8659722222222223 | 0 |
| 0.8666666666666667 | 0 |
| 0.8673611111111111 | 0 |
| 0.8680555555555555 | 0 |
| 0.86875 | 0 |
| 0.8694444444444445 | 0 |
| 0.8701388888888889 | 0 |
| 0.8708333333333332 | 0 |
| 0.8715277777777778 | 0 |
| 0.8722222222222222 | 0 |
| 0.8729166666666667 | 0 |
| 0.873611111111111 | 0 |
| 0.8743055555555556 | 0 |
| 0.875 | 0 |
| 0.8756944444444444 | 0 |
| 0.876388888888889 | 0 |
| 0.8770833333333333 | 0 |
| 0.8777777777777778 | 0 |
| 0.8784722222222222 | 0 |
| 0.8791666666666668 | 0 |
| 0.8798611111111111 | 0 |
| 0.8805555555555555 | 0 |
| 0.88125 | 0 |
| 0.8819444444444445 | 0 |
| 0.8826388888888889 | 0 |
| 0.8833333333333333 | 0 |
| 0.8840277777777777 | 0 |
| 0.8847222222222223 | 0 |
| 0.8854166666666666 | 0 |
| 0.8861111111111111 | 0 |
| 0.8868055555555556 | 0 |
| 0.8875000000000001 | 0 |
| 0.8881944444444444 | 0 |
| 0.8888888888888888 | 0 |
| 0.8895833333333334 | 0 |
| 0.8902777777777778 | 0 |
| 0.8909722222222222 | 0 |
| 0.8916666666666666 | 0 |
| 0.8923611111111112 | 0 |
| 0.8930555555555556 | 0 |
| 0.8937499999999999 | 0 |
| 0.8944444444444444 | 0 |
| 0.8951388888888889 | 0 |
| 0.8958333333333334 | 0 |
| 0.8965277777777777 | 0 |
| 0.8972222222222223 | 0 |
| 0.8979166666666667 | 0 |
| 0.8986111111111111 | 0 |
| 0.8993055555555555 | 0 |
| 0.9 | 0 |
| 0.9006944444444445 | 0 |
| 0.9013888888888889 | 0 |
| 0.9020833333333332 | 0 |
| 0.9027777777777778 | 0 |
| 0.9034722222222222 | 0 |
| 0.9041666666666667 | 0 |
| 0.904861111111111 | 0 |
| 0.9055555555555556 | 0 |
| 0.90625 | 0 |
| 0.9069444444444444 | 0 |
| 0.907638888888889 | 0 |
| 0.9083333333333333 | 0 |
| 0.9090277777777778 | 0 |
| 0.9097222222222222 | 0 |
| 0.9104166666666668 | 0 |
| 0.9111111111111111 | 0 |
| 0.9118055555555555 | 0 |
| 0.9125 | 0 |
| 0.9131944444444445 | 0 |
| 0.9138888888888889 | 0 |
| 0.9145833333333333 | 0 |
| 0.9152777777777777 | 0 |
| 0.9159722222222223 | 0 |
| 0.9166666666666666 | 0 |
| 0.9173611111111111 | 0 |
| 0.9180555555555556 | 0 |
| 0.9187500000000001 | 0 |
| 0.9194444444444444 | 0 |
| 0.9201388888888888 | 0 |
| 0.9208333333333334 | 0 |
| 0.9215277777777778 | 0 |
| 0.9222222222222222 | 0 |
| 0.9229166666666666 | 0 |
| 0.9236111111111112 | 0 |
| 0.9243055555555556 | 0 |
| 0.9249999999999999 | 0 |
| 0.9256944444444444 | 0 |
| 0.9263888888888889 | 0 |
| 0.9270833333333334 | 0 |
| 0.9277777777777777 | 0 |
| 0.9284722222222223 | 0 |
| 0.9291666666666667 | 0 |
| 0.9298611111111111 | 0 |
| 0.9305555555555555 | 0 |
| 0.93125 | 0 |
| 0.9319444444444445 | 0 |
| 0.9326388888888889 | 0 |
| 0.9333333333333332 | 0 |
| 0.9340277777777778 | 0 |
| 0.9347222222222222 | 0 |
| 0.9354166666666667 | 0 |
| 0.936111111111111 | 0 |
| 0.9368055555555556 | 0 |
| 0.9375 | 0 |
| 0.9381944444444444 | 0 |
| 0.938888888888889 | 0 |
| 0.9395833333333333 | 0 |
| 0.9402777777777778 | 0 |
| 0.9409722222222222 | 0 |
| 0.9416666666666668 | 0 |
| 0.9423611111111111 | 0 |
| 0.9430555555555555 | 0 |
| 0.94375 | 0 |
| 0.9444444444444445 | 0 |
| 0.9451388888888889 | 0 |
| 0.9458333333333333 | 0 |
| 0.9465277777777777 | 0 |
| 0.9472222222222223 | 0 |
| 0.9479166666666666 | 0 |
| 0.9486111111111111 | 0 |
| 0.9493055555555556 | 0 |
| 0.9500000000000001 | 0 |
| 0.9506944444444444 | 0 |
| 0.9513888888888888 | 0 |
| 0.9520833333333334 | 0 |
| 0.9527777777777778 | 0 |
| 0.9534722222222222 | 0 |
| 0.9541666666666666 | 0 |
| 0.9548611111111112 | 0 |
| 0.9555555555555556 | 0 |
| 0.9562499999999999 | 0 |
| 0.9569444444444444 | 0 |
| 0.9576388888888889 | 0 |
| 0.9583333333333334 | 0 |
| 0.9590277777777777 | 0 |
| 0.9597222222222223 | 0 |
| 0.9604166666666667 | 0 |
| 0.9611111111111111 | 0 |
| 0.9618055555555555 | 0 |
| 0.9625 | 0 |
| 0.9631944444444445 | 0 |
| 0.9638888888888889 | 0 |
| 0.9645833333333332 | 0 |
| 0.9652777777777778 | 0 |
| 0.9659722222222222 | 0 |
| 0.9666666666666667 | 0 |
| 0.967361111111111 | 0 |
| 0.9680555555555556 | 0 |
| 0.96875 | 0 |
| 0.9694444444444444 | 0 |
| 0.970138888888889 | 0 |
| 0.9708333333333333 | 0 |
| 0.9715277777777778 | 0 |
| 0.9722222222222222 | 0 |
| 0.9729166666666668 | 0 |
| 0.9736111111111111 | 0 |
| 0.9743055555555555 | 0 |
| 0.975 | 0 |
| 0.9756944444444445 | 0 |
| 0.9763888888888889 | 0 |
| 0.9770833333333333 | 0 |
| 0.9777777777777777 | 0 |
| 0.9784722222222223 | 0 |
| 0.9791666666666666 | 0 |
| 0.9798611111111111 | 0 |
| 0.9805555555555556 | 0 |
| 0.9812500000000001 | 0 |
| 0.9819444444444444 | 0 |
| 0.9826388888888888 | 0 |
| 0.9833333333333334 | 0 |
| 0.9840277777777778 | 0 |
| 0.9847222222222222 | 0 |
| 0.9854166666666666 | 0 |
| 0.9861111111111112 | 0 |
| 0.9868055555555556 | 0 |
| 0.9874999999999999 | 0 |
| 0.9881944444444444 | 0 |
| 0.9888888888888889 | 0 |
| 0.9895833333333334 | 0 |
| 0.9902777777777777 | 0 |
| 0.9909722222222223 | 0 |
| 0.9916666666666667 | 0 |
| 0.9923611111111111 | 0 |
| 0.9930555555555555 | 0 |
| 0.99375 | 0 |
| 0.9944444444444445 | 0 |
| 0.9951388888888889 | 0 |
| 0.9958333333333332 | 0 |
| 0.9965277777777778 | 0 |
| 0.9972222222222222 | 0 |
| 0.9979166666666667 | 0 |
| 0.998611111111111 | 0 |
| 0.9993055555555556 | 0 |